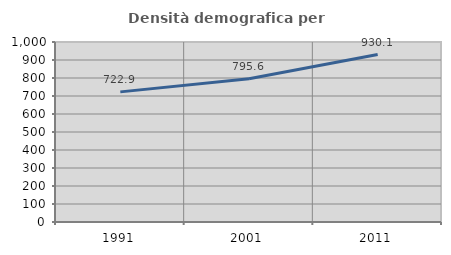
| Category | Densità demografica |
|---|---|
| 1991.0 | 722.892 |
| 2001.0 | 795.634 |
| 2011.0 | 930.114 |